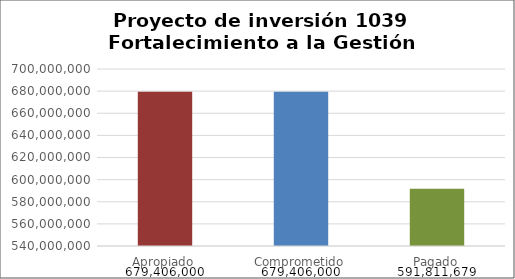
| Category | Series 0 |
|---|---|
| Apropiado | 679406000 |
| Comprometido | 679406000 |
| Pagado | 591811679 |